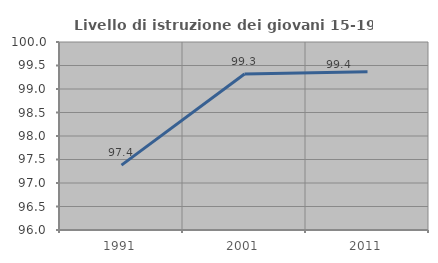
| Category | Livello di istruzione dei giovani 15-19 anni |
|---|---|
| 1991.0 | 97.38 |
| 2001.0 | 99.32 |
| 2011.0 | 99.367 |